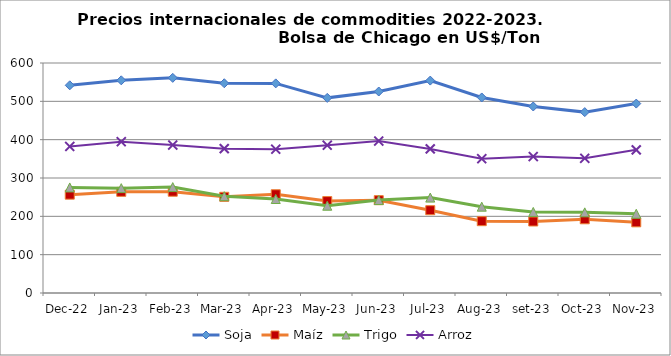
| Category | Soja | Maíz | Trigo | Arroz |
|---|---|---|---|---|
| dic-22 | 541.777 | 256.518 | 275.362 | 382.237 |
| ene-23 | 554.82 | 263.927 | 273.575 | 394.717 |
| feb-23 | 561.249 | 264.197 | 276.216 | 385.985 |
| mar-23 | 547.173 | 250.935 | 252.587 | 376.526 |
| abr-23 | 546.829 | 257.603 | 245.217 | 375.203 |
| may-23 | 509.056 | 239.739 | 227.673 | 385.566 |
| jun-23 | 525.635 | 242.199 | 242.507 | 396.327 |
| jul-23 | 554.108 | 215.994 | 248.913 | 375.886 |
| ago-23 | 510.089 | 187.352 | 225.216 | 350.419 |
| set-23 | 486.552 | 186.54 | 211.508 | 356.019 |
| oct-23 | 471.879 | 192.298 | 210.405 | 351.433 |
| nov-23 | 494.107 | 184.375 | 206.731 | 373.439 |